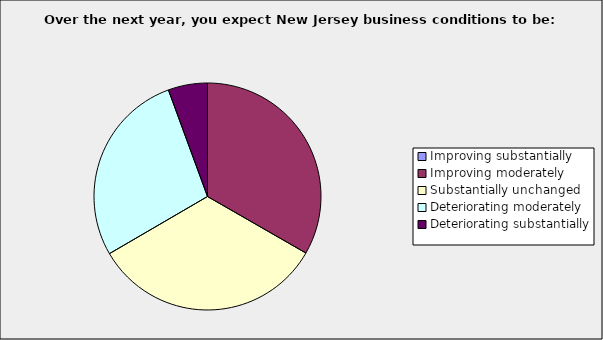
| Category | Series 0 |
|---|---|
| Improving substantially | 0 |
| Improving moderately | 0.333 |
| Substantially unchanged | 0.333 |
| Deteriorating moderately | 0.278 |
| Deteriorating substantially | 0.056 |